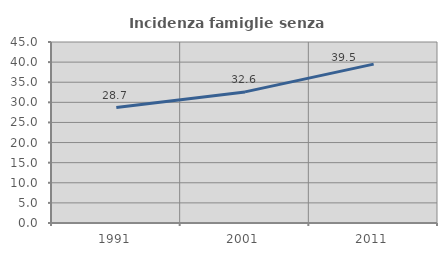
| Category | Incidenza famiglie senza nuclei |
|---|---|
| 1991.0 | 28.707 |
| 2001.0 | 32.595 |
| 2011.0 | 39.497 |